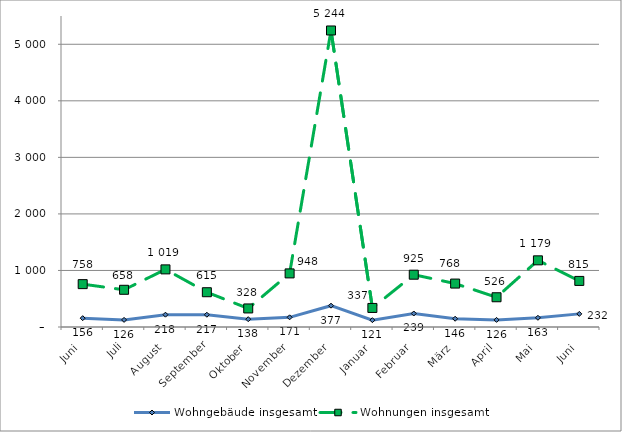
| Category | Wohngebäude insgesamt | Wohnungen insgesamt |
|---|---|---|
| Juni | 156 | 758 |
| Juli | 126 | 658 |
| August | 218 | 1019 |
| September | 217 | 615 |
| Oktober | 138 | 328 |
| November | 171 | 948 |
| Dezember | 377 | 5244 |
| Januar | 121 | 337 |
| Februar | 239 | 925 |
| März | 146 | 768 |
| April | 126 | 526 |
| Mai | 163 | 1179 |
| Juni | 232 | 815 |